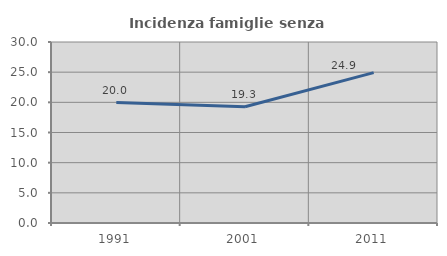
| Category | Incidenza famiglie senza nuclei |
|---|---|
| 1991.0 | 19.958 |
| 2001.0 | 19.267 |
| 2011.0 | 24.932 |